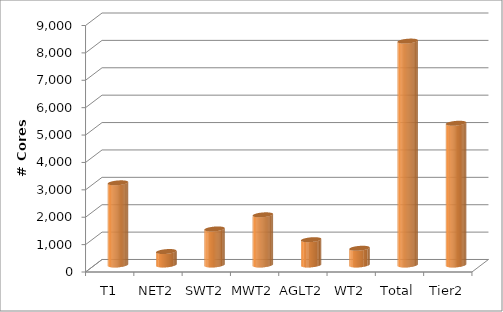
| Category | Series 0 |
|---|---|
| T1 | 3000 |
| NET2 | 492 |
| SWT2 | 1316 |
| MWT2 | 1832 |
| AGLT2 | 924 |
| WT2 | 611.16 |
| Total | 8175.16 |
| Tier2 | 5175.16 |